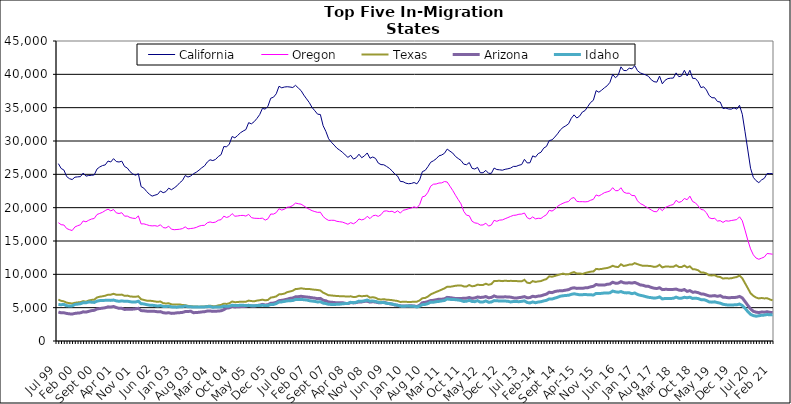
| Category | California | Oregon | Texas | Arizona | Idaho |
|---|---|---|---|---|---|
| Jul 99 | 26605 | 17749 | 6209 | 4339 | 5471 |
| Aug 99 | 25882 | 17447 | 6022 | 4228 | 5444 |
| Sep 99 | 25644 | 17401 | 5941 | 4237 | 5488 |
| Oct 99 | 24669 | 16875 | 5751 | 4134 | 5279 |
| Nov 99 | 24353 | 16701 | 5680 | 4073 | 5260 |
| Dec 99 | 24218 | 16570 | 5619 | 4042 | 5269 |
| Jan 00 | 24574 | 17109 | 5736 | 4142 | 5485 |
| Feb 00 | 24620 | 17295 | 5789 | 4192 | 5530 |
| Mar 00 | 24655 | 17436 | 5826 | 4226 | 5590 |
| Apr 00 | 25195 | 18009 | 5980 | 4375 | 5748 |
| May 00 | 24730 | 17875 | 5897 | 4337 | 5729 |
| Jun 00 | 24825 | 18113 | 6070 | 4444 | 5853 |
| Jul 00 | 24857 | 18294 | 6163 | 4555 | 5824 |
| Aug 00 | 24913 | 18376 | 6199 | 4603 | 5788 |
| Sep 00 | 25792 | 18971 | 6529 | 4804 | 5976 |
| Oct 00 | 26106 | 19135 | 6643 | 4870 | 6058 |
| Nov 00 | 26315 | 19306 | 6705 | 4926 | 6085 |
| Dec 00 | 26415 | 19570 | 6793 | 4991 | 6096 |
| Jan 01 | 26995 | 19781 | 6942 | 5122 | 6119 |
| Feb 01 | 26851 | 19519 | 6948 | 5089 | 6090 |
| Mar 01 | 27352 | 19720 | 7080 | 5180 | 6143 |
| Apr 01 | 26918 | 19221 | 6943 | 5020 | 6020 |
| May 01 | 26848 | 19126 | 6924 | 4899 | 5950 |
| Jun 01 | 26974 | 19241 | 6959 | 4895 | 6019 |
| Jul 01 | 26172 | 18725 | 6778 | 4737 | 5951 |
| Aug 01 | 25943 | 18736 | 6810 | 4757 | 5973 |
| Sep 01 | 25399 | 18514 | 6688 | 4753 | 5895 |
| Oct 01 | 25050 | 18415 | 6650 | 4780 | 5833 |
| Nov 01 | 24873 | 18381 | 6631 | 4826 | 5850 |
| Dec 01 | 25099 | 18765 | 6708 | 4898 | 5969 |
| Jan 02 | 23158 | 17561 | 6261 | 4560 | 5595 |
| Feb 02 | 22926 | 17573 | 6162 | 4531 | 5560 |
| Mar 02 | 22433 | 17452 | 6052 | 4481 | 5458 |
| Apr 02 | 22012 | 17314 | 6046 | 4458 | 5380 |
| May 02 | 21733 | 17267 | 6007 | 4452 | 5358 |
| Jun 02 | 21876 | 17298 | 5933 | 4444 | 5315 |
| Jul 02 | 21997 | 17209 | 5873 | 4383 | 5243 |
| Aug 02 | 22507 | 17436 | 5929 | 4407 | 5315 |
| Sep 02 | 22244 | 17010 | 5672 | 4248 | 5192 |
| Oct 02 | 22406 | 16952 | 5625 | 4191 | 5167 |
| Nov 02 | 22922 | 17223 | 5663 | 4242 | 5221 |
| Dec 02 | 22693 | 16770 | 5499 | 4142 | 5120 |
| Jan 03 | 22964 | 16694 | 5463 | 4166 | 5089 |
| Feb 03 | 23276 | 16727 | 5461 | 4226 | 5077 |
| Mar 03 | 23736 | 16766 | 5486 | 4251 | 5145 |
| Apr 03 | 24079 | 16859 | 5389 | 4289 | 5145 |
| May 03 | 24821 | 17117 | 5378 | 4415 | 5254 |
| Jun 03 | 24592 | 16812 | 5273 | 4426 | 5135 |
| Jul 03 | 24754 | 16875 | 5226 | 4466 | 5124 |
| Aug 03 | 25092 | 16922 | 5181 | 4244 | 5100 |
| Sep 03 | 25316 | 17036 | 5181 | 4279 | 5086 |
| Oct 03 | 25622 | 17228 | 5139 | 4301 | 5110 |
| Nov 03 | 25984 | 17335 | 5175 | 4362 | 5091 |
| Dec 03 | 26269 | 17350 | 5189 | 4396 | 5113 |
| Jan 04 | 26852 | 17734 | 5255 | 4492 | 5152 |
| Feb 04 | 27184 | 17860 | 5301 | 4502 | 5183 |
| Mar 04 | 27062 | 17757 | 5227 | 4443 | 5056 |
| Apr 04 | 27238 | 17840 | 5227 | 4461 | 5104 |
| May 04 | 27671 | 18113 | 5345 | 4493 | 5095 |
| Jun 04 | 27949 | 18201 | 5416 | 4532 | 5103 |
| Jul 04 | 29172 | 18727 | 5597 | 4697 | 5231 |
| Aug 04 | 29122 | 18529 | 5561 | 4945 | 5197 |
| Sep 04 | 29542 | 18678 | 5656 | 4976 | 5237 |
| Oct 04 | 30674 | 19108 | 5922 | 5188 | 5363 |
| Nov 04 | 30472 | 18716 | 5823 | 5106 | 5321 |
| Dec 04 | 30831 | 18755 | 5838 | 5135 | 5312 |
| Jan 05 | 31224 | 18823 | 5906 | 5155 | 5374 |
| Feb 05 | 31495 | 18842 | 5898 | 5168 | 5357 |
| Mar 05 | 31714 | 18738 | 5894 | 5212 | 5313 |
| Apr 05 | 32750 | 18998 | 6060 | 5340 | 5350 |
| May 05 | 32575 | 18504 | 5989 | 5269 | 5276 |
| Jun 05 | 32898 | 18414 | 5954 | 5252 | 5271 |
| Jul 05 | 33384 | 18395 | 6062 | 5322 | 5322 |
| Aug 05 | 33964 | 18381 | 6113 | 5375 | 5316 |
| Sep 05 | 34897 | 18426 | 6206 | 5493 | 5362 |
| Oct 05 | 34780 | 18132 | 6100 | 5408 | 5308 |
| Nov 05 | 35223 | 18332 | 6162 | 5434 | 5314 |
| Dec 05 | 36415 | 19047 | 6508 | 5658 | 5487 |
| Jan 06 | 36567 | 19032 | 6576 | 5688 | 5480 |
| Feb 06 | 37074 | 19257 | 6692 | 5792 | 5616 |
| Mar 06 | 38207 | 19845 | 6993 | 6052 | 5850 |
| Apr 06 | 37976 | 19637 | 7024 | 6101 | 5864 |
| May 06 | 38099 | 19781 | 7114 | 6178 | 5943 |
| Jun 06 | 38141 | 20061 | 7331 | 6276 | 6018 |
| Jul 06 | 38097 | 20111 | 7431 | 6399 | 6046 |
| Aug 06 | 38021 | 20333 | 7542 | 6450 | 6064 |
| Sep 06 | 38349 | 20686 | 7798 | 6627 | 6232 |
| Oct 06 | 37947 | 20591 | 7825 | 6647 | 6216 |
| Nov 06 | 37565 | 20526 | 7907 | 6707 | 6244 |
| Dec 06 | 36884 | 20272 | 7840 | 6648 | 6192 |
| Jan 07 | 36321 | 19984 | 7789 | 6597 | 6151 |
| Feb 07 | 35752 | 19752 | 7799 | 6554 | 6048 |
| Mar 07 | 35025 | 19547 | 7737 | 6487 | 5989 |
| Apr 07 | 34534 | 19412 | 7685 | 6430 | 5937 |
| May 07 | 34022 | 19296 | 7654 | 6353 | 5858 |
| Jun 07 | 33974 | 19318 | 7577 | 6390 | 5886 |
| Jul 07 | 32298 | 18677 | 7250 | 6117 | 5682 |
| Aug 07 | 31436 | 18322 | 7070 | 6034 | 5617 |
| Sep 07 | 30331 | 18087 | 6853 | 5847 | 5500 |
| Oct 07 | 29813 | 18108 | 6839 | 5821 | 5489 |
| Nov 07 | 29384 | 18105 | 6777 | 5769 | 5481 |
| Dec 07 | 28923 | 17949 | 6760 | 5733 | 5499 |
| Jan 08 | 28627 | 17890 | 6721 | 5732 | 5521 |
| Feb 08 | 28328 | 17834 | 6719 | 5749 | 5579 |
| Mar 08 | 27911 | 17680 | 6690 | 5650 | 5614 |
| Apr 08 | 27543 | 17512 | 6656 | 5612 | 5635 |
| May 08 | 27856 | 17754 | 6705 | 5774 | 5798 |
| Jun 08 | 27287 | 17589 | 6593 | 5717 | 5745 |
| Jul 08 | 27495 | 17834 | 6623 | 5761 | 5807 |
| Aug 08 | 28018 | 18309 | 6789 | 5867 | 5982 |
| Sep-08 | 27491 | 18164 | 6708 | 5864 | 5954 |
| Oct 08 | 27771 | 18291 | 6755 | 5942 | 6032 |
| Nov 08 | 28206 | 18706 | 6787 | 5970 | 6150 |
| Dec 08 | 27408 | 18353 | 6505 | 5832 | 5975 |
| Jan 09 | 27601 | 18778 | 6569 | 5890 | 5995 |
| Feb 09 | 27394 | 18863 | 6483 | 5845 | 5936 |
| Mar 09 | 26690 | 18694 | 6273 | 5751 | 5806 |
| Apr 09 | 26461 | 18943 | 6222 | 5735 | 5777 |
| May 09 | 26435 | 19470 | 6272 | 5819 | 5767 |
| Jun 09 | 26187 | 19522 | 6199 | 5700 | 5649 |
| Jul 09 | 25906 | 19408 | 6171 | 5603 | 5617 |
| Aug 09 | 25525 | 19469 | 6128 | 5533 | 5540 |
| Sep 09 | 25050 | 19249 | 6059 | 5405 | 5437 |
| Oct 09 | 24741 | 19529 | 6004 | 5349 | 5369 |
| Nov 09 | 23928 | 19187 | 5854 | 5271 | 5248 |
| Dec 09 | 23899 | 19607 | 5886 | 5261 | 5195 |
| Jan 10 | 23676 | 19703 | 5881 | 5232 | 5234 |
| Feb 10 | 23592 | 19845 | 5850 | 5272 | 5236 |
| Mar 10 | 23634 | 19946 | 5864 | 5278 | 5219 |
| Apr 10 | 23774 | 20134 | 5889 | 5257 | 5201 |
| May 10 | 23567 | 19966 | 5897 | 5172 | 5105 |
| Jun 10 | 24166 | 20464 | 6087 | 5356 | 5237 |
| Jul 10 | 25410 | 21627 | 6417 | 5742 | 5452 |
| Aug 10 | 25586 | 21744 | 6465 | 5797 | 5491 |
| Sep 10 | 26150 | 22314 | 6667 | 5907 | 5609 |
| Oct 10 | 26807 | 23219 | 6986 | 6070 | 5831 |
| Nov 10 | 27033 | 23520 | 7179 | 6100 | 5810 |
| Dec 10 | 27332 | 23551 | 7361 | 6182 | 5898 |
| Jan 11 | 27769 | 23697 | 7525 | 6276 | 5938 |
| Feb 11 | 27898 | 23718 | 7708 | 6267 | 6016 |
| Mar 11 | 28155 | 23921 | 7890 | 6330 | 6081 |
| Apr 11 | 28790 | 23847 | 8146 | 6544 | 6305 |
| May 11 | 28471 | 23215 | 8131 | 6502 | 6248 |
| Jun 11 | 28191 | 22580 | 8199 | 6445 | 6217 |
| Jul 11 | 27678 | 21867 | 8291 | 6368 | 6202 |
| Aug 11 | 27372 | 21203 | 8321 | 6356 | 6146 |
| Sep 11 | 27082 | 20570 | 8341 | 6387 | 6075 |
| Oct 11 | 26528 | 19442 | 8191 | 6402 | 5932 |
| Nov 11 | 26440 | 18872 | 8176 | 6426 | 5968 |
| Dec 11 | 26770 | 18784 | 8401 | 6533 | 6106 |
| Jan 12 | 25901 | 17963 | 8202 | 6390 | 5933 |
| Feb 12 | 25796 | 17718 | 8266 | 6456 | 5900 |
| Mar 12 | 26042 | 17647 | 8456 | 6600 | 6054 |
| Apr 12 | 25239 | 17386 | 8388 | 6534 | 5838 |
| May 12 | 25238 | 17407 | 8401 | 6558 | 5854 |
| Jun 12 | 25593 | 17673 | 8594 | 6669 | 6009 |
| Jul 12 | 25155 | 17237 | 8432 | 6474 | 5817 |
| Aug 12 | 25146 | 17391 | 8536 | 6539 | 5842 |
| Sep 12 | 25942 | 18102 | 8989 | 6759 | 6061 |
| Oct 12 | 25718 | 17953 | 9012 | 6618 | 6027 |
| Nov 12 | 25677 | 18134 | 9032 | 6611 | 6009 |
| Dec 12 | 25619 | 18166 | 8981 | 6601 | 5999 |
| Jan 13 | 25757 | 18344 | 9051 | 6627 | 5989 |
| Feb-13 | 25830 | 18512 | 9001 | 6606 | 5968 |
| Mar-13 | 25940 | 18689 | 9021 | 6577 | 5853 |
| Apr 13 | 26187 | 18844 | 9013 | 6478 | 5925 |
| May 13 | 26192 | 18884 | 9003 | 6431 | 5924 |
| Jun-13 | 26362 | 19013 | 8948 | 6508 | 5896 |
| Jul 13 | 26467 | 19037 | 8958 | 6559 | 5948 |
| Aug 13 | 27253 | 19198 | 9174 | 6655 | 6020 |
| Sep 13 | 26711 | 18501 | 8747 | 6489 | 5775 |
| Oct 13 | 26733 | 18301 | 8681 | 6511 | 5711 |
| Nov 13 | 27767 | 18620 | 8989 | 6709 | 5860 |
| Dec 13 | 27583 | 18320 | 8863 | 6637 | 5740 |
| Jan 14 | 28107 | 18409 | 8939 | 6735 | 5843 |
| Feb-14 | 28313 | 18383 | 8989 | 6779 | 5893 |
| Mar 14 | 28934 | 18696 | 9160 | 6918 | 6015 |
| Apr 14 | 29192 | 18946 | 9291 | 7036 | 6099 |
| May 14 | 30069 | 19603 | 9701 | 7314 | 6304 |
| Jun 14 | 30163 | 19487 | 9641 | 7252 | 6293 |
| Jul-14 | 30587 | 19754 | 9752 | 7415 | 6427 |
| Aug-14 | 31074 | 20201 | 9882 | 7499 | 6557 |
| Sep 14 | 31656 | 20459 | 9997 | 7536 | 6719 |
| Oct 14 | 32037 | 20663 | 10109 | 7555 | 6786 |
| Nov 14 | 32278 | 20825 | 9992 | 7628 | 6831 |
| Dec 14 | 32578 | 20918 | 10006 | 7705 | 6860 |
| Jan 15 | 33414 | 21396 | 10213 | 7906 | 7000 |
| Feb 15 | 33922 | 21518 | 10337 | 7982 | 7083 |
| Mar 15 | 33447 | 20942 | 10122 | 7891 | 7006 |
| Apr-15 | 33731 | 20893 | 10138 | 7906 | 6931 |
| May 15 | 34343 | 20902 | 10053 | 7895 | 6952 |
| Jun-15 | 34572 | 20870 | 10192 | 7973 | 6966 |
| Jul 15 | 35185 | 20916 | 10303 | 8000 | 6949 |
| Aug 15 | 35780 | 21115 | 10399 | 8126 | 6938 |
| Sep 15 | 36109 | 21246 | 10428 | 8207 | 6896 |
| Oct 15 | 37555 | 21908 | 10813 | 8477 | 7140 |
| Nov 15 | 37319 | 21750 | 10763 | 8390 | 7112 |
| Dec 15 | 37624 | 21990 | 10807 | 8395 | 7149 |
| Jan 16 | 37978 | 22248 | 10892 | 8388 | 7201 |
| Feb 16 | 38285 | 22369 | 10951 | 8508 | 7192 |
| Mar 16 | 38792 | 22506 | 11075 | 8547 | 7226 |
| Apr 16 | 39994 | 22999 | 11286 | 8815 | 7487 |
| May 16 | 39488 | 22548 | 11132 | 8673 | 7382 |
| Jun 16 | 39864 | 22556 | 11100 | 8682 | 7315 |
| Jul 16 | 41123 | 22989 | 11516 | 8903 | 7420 |
| Aug 16 | 40573 | 22333 | 11251 | 8731 | 7261 |
| Sep 16 | 40560 | 22162 | 11340 | 8692 | 7216 |
| Oct 16 | 40923 | 22172 | 11456 | 8742 | 7233 |
| Nov 16 | 40817 | 21818 | 11459 | 8685 | 7101 |
| Dec 16 | 41311 | 21815 | 11681 | 8783 | 7203 |
| Jan 17 | 40543 | 21029 | 11524 | 8609 | 6982 |
| Feb 17 | 40218 | 20613 | 11385 | 8416 | 6852 |
| Mar 17 | 40052 | 20425 | 11276 | 8354 | 6775 |
| Apr 17 | 39913 | 20147 | 11297 | 8218 | 6653 |
| May 17 | 39695 | 19910 | 11265 | 8196 | 6552 |
| Jun 17 | 39177 | 19650 | 11225 | 8034 | 6500 |
| Jul 17 | 38901 | 19419 | 11115 | 7923 | 6429 |
| Aug 17 | 38827 | 19389 | 11168 | 7867 | 6479 |
| Sep 17 | 39736 | 19936 | 11426 | 7991 | 6609 |
| Oct 17 | 38576 | 19547 | 11041 | 7708 | 6315 |
| Nov 17 | 39108 | 20013 | 11158 | 7746 | 6381 |
| Dec 17 | 39359 | 20202 | 11185 | 7743 | 6366 |
| Jan 18 | 39420 | 20362 | 11118 | 7736 | 6380 |
| Feb 18 | 39440 | 20476 | 11128 | 7741 | 6407 |
| Mar 18 | 40218 | 21106 | 11362 | 7789 | 6578 |
| Apr 18 | 39637 | 20788 | 11111 | 7642 | 6423 |
| May 18 | 39777 | 20933 | 11097 | 7591 | 6430 |
| Jun 18 | 40602 | 21381 | 11317 | 7721 | 6554 |
| Jul 18 | 39767 | 21189 | 11038 | 7445 | 6489 |
| Aug 18 | 40608 | 21729 | 11200 | 7560 | 6569 |
| Sep 18 | 39395 | 20916 | 10772 | 7318 | 6383 |
| Oct 18 | 39383 | 20724 | 10740 | 7344 | 6429 |
| Nov 18 | 38891 | 20265 | 10605 | 7255 | 6365 |
| Dec 18 | 38013 | 19741 | 10292 | 7069 | 6205 |
| Jan 19 | 38130 | 19643 | 10261 | 7032 | 6203 |
| Feb 19 | 37658 | 19237 | 10132 | 6892 | 6073 |
| Mar 19 | 36831 | 18492 | 9848 | 6766 | 5863 |
| Apr 19 | 36492 | 18349 | 9839 | 6763 | 5827 |
| May 19 | 36481 | 18407 | 9867 | 6809 | 5873 |
| Jun 19 | 35925 | 17998 | 9661 | 6698 | 5761 |
| Jul 19 | 35843 | 18049 | 9598 | 6800 | 5673 |
| Aug 19 | 34870 | 17785 | 9361 | 6577 | 5512 |
| Sep 19 | 34945 | 18038 | 9428 | 6547 | 5437 |
| Oct 19 | 34802 | 17977 | 9385 | 6483 | 5390 |
| Nov 19 | 34775 | 18072 | 9403 | 6511 | 5401 |
| Dec 19 | 34976 | 18140 | 9518 | 6521 | 5419 |
| Jan 20 | 34774 | 18209 | 9594 | 6561 | 5434 |
| Feb 20 | 35352 | 18632 | 9804 | 6682 | 5543 |
| Mar 20 | 34013 | 18041 | 9411 | 6464 | 5330 |
| Apr 20 | 31385 | 16629 | 8666 | 5922 | 4906 |
| May 20 | 28657 | 15123 | 7927 | 5355 | 4419 |
| Jun 20 | 25915 | 13817 | 7164 | 4815 | 3992 |
| Jul 20 | 24545 | 12926 | 6776 | 4457 | 3810 |
| Aug 20 | 24048 | 12443 | 6521 | 4326 | 3720 |
| Sep 20 | 23756 | 12258 | 6386 | 4266 | 3784 |
| Oct 20 | 24166 | 12429 | 6452 | 4347 | 3861 |
| Nov 20 | 24404 | 12597 | 6386 | 4324 | 3883 |
| Dec 20 | 25120 | 13122 | 6420 | 4394 | 3974 |
| Jan 21 | 25111 | 13080 | 6236 | 4304 | 3924 |
| Feb 21 | 25114 | 13015 | 6094 | 4260 | 3930 |